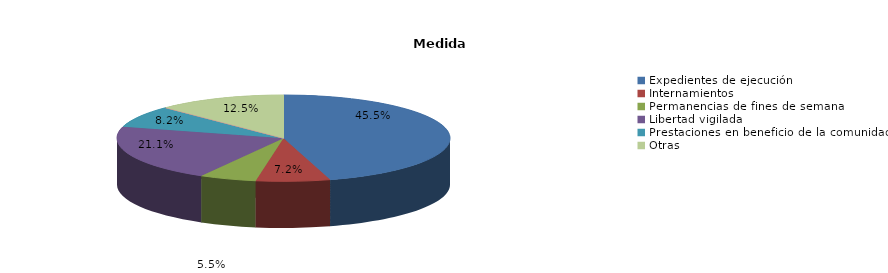
| Category | Series 0 |
|---|---|
| Expedientes de ejecución | 222 |
| Internamientos | 35 |
| Permanencias de fines de semana | 27 |
| Libertad vigilada | 103 |
| Prestaciones en beneficio de la comunidad | 40 |
| Privación de permisos y licencias | 0 |
| Convivencia Familiar Educativa | 0 |
| Amonestaciones | 0 |
| Otras | 61 |